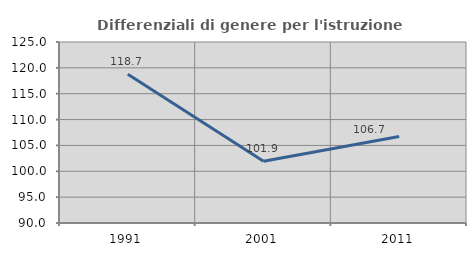
| Category | Differenziali di genere per l'istruzione superiore |
|---|---|
| 1991.0 | 118.746 |
| 2001.0 | 101.94 |
| 2011.0 | 106.726 |